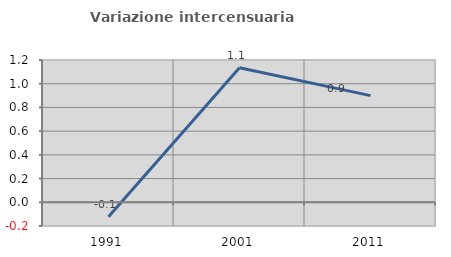
| Category | Variazione intercensuaria annua |
|---|---|
| 1991.0 | -0.122 |
| 2001.0 | 1.134 |
| 2011.0 | 0.9 |